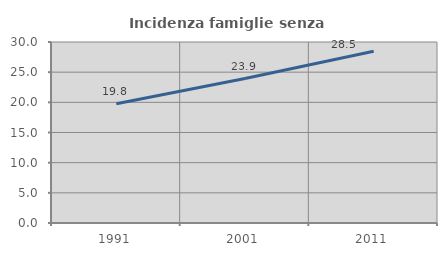
| Category | Incidenza famiglie senza nuclei |
|---|---|
| 1991.0 | 19.771 |
| 2001.0 | 23.938 |
| 2011.0 | 28.462 |